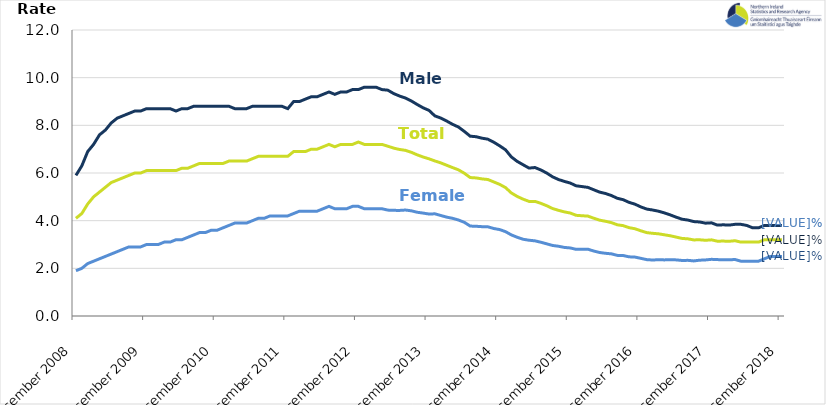
| Category | Male | Female | Total |
|---|---|---|---|
| 2008-12-01 | 5.9 | 1.9 | 4.1 |
| 2009-01-01 | 6.3 | 2 | 4.3 |
| 2009-02-01 | 6.9 | 2.2 | 4.7 |
| 2009-03-01 | 7.2 | 2.3 | 5 |
| 2009-04-01 | 7.6 | 2.4 | 5.2 |
| 2009-05-01 | 7.8 | 2.5 | 5.4 |
| 2009-06-01 | 8.1 | 2.6 | 5.6 |
| 2009-07-01 | 8.3 | 2.7 | 5.7 |
| 2009-08-01 | 8.4 | 2.8 | 5.8 |
| 2009-09-01 | 8.5 | 2.9 | 5.9 |
| 2009-10-01 | 8.6 | 2.9 | 6 |
| 2009-11-01 | 8.6 | 2.9 | 6 |
| 2009-12-01 | 8.7 | 3 | 6.1 |
| 2010-01-01 | 8.7 | 3 | 6.1 |
| 2010-02-01 | 8.7 | 3 | 6.1 |
| 2010-03-01 | 8.7 | 3.1 | 6.1 |
| 2010-04-01 | 8.7 | 3.1 | 6.1 |
| 2010-05-01 | 8.6 | 3.2 | 6.1 |
| 2010-06-01 | 8.7 | 3.2 | 6.2 |
| 2010-07-01 | 8.7 | 3.3 | 6.2 |
| 2010-08-01 | 8.8 | 3.4 | 6.3 |
| 2010-09-01 | 8.8 | 3.5 | 6.4 |
| 2010-10-01 | 8.8 | 3.5 | 6.4 |
| 2010-11-01 | 8.8 | 3.6 | 6.4 |
| 2010-12-01 | 8.8 | 3.6 | 6.4 |
| 2011-01-01 | 8.8 | 3.7 | 6.4 |
| 2011-02-01 | 8.8 | 3.8 | 6.5 |
| 2011-03-01 | 8.7 | 3.9 | 6.5 |
| 2011-04-01 | 8.7 | 3.9 | 6.5 |
| 2011-05-01 | 8.7 | 3.9 | 6.5 |
| 2011-06-01 | 8.8 | 4 | 6.6 |
| 2011-07-01 | 8.8 | 4.1 | 6.7 |
| 2011-08-01 | 8.8 | 4.1 | 6.7 |
| 2011-09-01 | 8.8 | 4.2 | 6.7 |
| 2011-10-01 | 8.8 | 4.2 | 6.7 |
| 2011-11-01 | 8.8 | 4.2 | 6.7 |
| 2011-12-01 | 8.7 | 4.2 | 6.7 |
| 2012-01-01 | 9 | 4.3 | 6.9 |
| 2012-02-01 | 9 | 4.4 | 6.9 |
| 2012-03-01 | 9.1 | 4.4 | 6.9 |
| 2012-04-01 | 9.2 | 4.4 | 7 |
| 2012-05-01 | 9.2 | 4.4 | 7 |
| 2012-06-01 | 9.3 | 4.5 | 7.1 |
| 2012-07-01 | 9.4 | 4.6 | 7.2 |
| 2012-08-01 | 9.3 | 4.5 | 7.1 |
| 2012-09-01 | 9.4 | 4.5 | 7.2 |
| 2012-10-01 | 9.4 | 4.5 | 7.2 |
| 2012-11-01 | 9.5 | 4.6 | 7.2 |
| 2012-12-01 | 9.5 | 4.6 | 7.3 |
| 2013-01-01 | 9.6 | 4.5 | 7.2 |
| 2013-02-01 | 9.6 | 4.5 | 7.2 |
| 2013-03-01 | 9.6 | 4.5 | 7.2 |
| 2013-04-01 | 9.5 | 4.5 | 7.2 |
| 2013-05-01 | 9.476 | 4.443 | 7.125 |
| 2013-06-01 | 9.332 | 4.433 | 7.043 |
| 2013-07-01 | 9.229 | 4.43 | 6.987 |
| 2013-08-01 | 9.146 | 4.446 | 6.95 |
| 2013-09-01 | 9.022 | 4.413 | 6.869 |
| 2013-10-01 | 8.874 | 4.352 | 6.761 |
| 2013-11-01 | 8.735 | 4.318 | 6.671 |
| 2013-12-01 | 8.627 | 4.278 | 6.595 |
| 2014-01-01 | 8.395 | 4.288 | 6.505 |
| 2014-02-01 | 8.306 | 4.217 | 6.424 |
| 2014-03-01 | 8.181 | 4.149 | 6.326 |
| 2014-04-01 | 8.043 | 4.098 | 6.228 |
| 2014-05-01 | 7.929 | 4.028 | 6.134 |
| 2014-06-01 | 7.745 | 3.931 | 5.99 |
| 2014-07-01 | 7.545 | 3.774 | 5.81 |
| 2014-08-01 | 7.522 | 3.765 | 5.793 |
| 2014-09-01 | 7.461 | 3.748 | 5.752 |
| 2014-10-01 | 7.419 | 3.743 | 5.727 |
| 2014-11-01 | 7.293 | 3.672 | 5.627 |
| 2014-12-01 | 7.141 | 3.626 | 5.523 |
| 2015-01-01 | 6.975 | 3.54 | 5.389 |
| 2015-02-01 | 6.672 | 3.401 | 5.162 |
| 2015-03-01 | 6.485 | 3.302 | 5.016 |
| 2015-04-01 | 6.344 | 3.219 | 4.901 |
| 2015-05-01 | 6.207 | 3.179 | 4.809 |
| 2015-06-01 | 6.229 | 3.154 | 4.809 |
| 2015-07-01 | 6.128 | 3.095 | 4.728 |
| 2015-08-01 | 5.999 | 3.028 | 4.627 |
| 2015-09-01 | 5.839 | 2.959 | 4.509 |
| 2015-10-01 | 5.727 | 2.927 | 4.434 |
| 2015-11-01 | 5.648 | 2.877 | 4.368 |
| 2015-12-01 | 5.578 | 2.856 | 4.321 |
| 2016-01-01 | 5.463 | 2.797 | 4.225 |
| 2016-02-01 | 5.431 | 2.796 | 4.207 |
| 2016-03-01 | 5.396 | 2.802 | 4.191 |
| 2016-04-01 | 5.297 | 2.726 | 4.103 |
| 2016-05-01 | 5.198 | 2.665 | 4.021 |
| 2016-06-01 | 5.14 | 2.631 | 3.974 |
| 2016-07-01 | 5.054 | 2.608 | 3.918 |
| 2016-08-01 | 4.939 | 2.544 | 3.827 |
| 2016-09-01 | 4.88 | 2.537 | 3.791 |
| 2016-10-01 | 4.768 | 2.483 | 3.707 |
| 2016-11-01 | 4.692 | 2.471 | 3.661 |
| 2016-12-01 | 4.577 | 2.42 | 3.575 |
| 2017-01-01 | 4.487 | 2.365 | 3.498 |
| 2017-02-01 | 4.447 | 2.349 | 3.469 |
| 2017-03-01 | 4.397 | 2.362 | 3.448 |
| 2017-04-01 | 4.326 | 2.354 | 3.407 |
| 2017-05-01 | 4.241 | 2.364 | 3.366 |
| 2017-06-01 | 4.147 | 2.354 | 3.311 |
| 2017-07-01 | 4.062 | 2.33 | 3.255 |
| 2017-08-01 | 4.025 | 2.335 | 3.237 |
| 2017-09-01 | 3.962 | 2.311 | 3.192 |
| 2017-10-01 | 3.945 | 2.341 | 3.198 |
| 2017-11-01 | 3.895 | 2.353 | 3.176 |
| 2017-12-01 | 3.909 | 2.378 | 3.196 |
| 2018-01-01 | 3.814 | 2.366 | 3.139 |
| 2018-02-01 | 3.826 | 2.361 | 3.143 |
| 2018-03-01 | 3.814 | 2.357 | 3.135 |
| 2018-04-01 | 3.846 | 2.371 | 3.159 |
| 2018-05-01 | 3.846 | 2.3 | 3.1 |
| 2018-06-01 | 3.8 | 2.3 | 3.1 |
| 2018-07-01 | 3.7 | 2.3 | 3.1 |
| 2018-08-01 | 3.7 | 2.3 | 3.1 |
| 2018-09-01 | 3.8 | 2.4 | 3.2 |
| 2018-10-01 | 3.8 | 2.5 | 3.2 |
| 2018-11-01 | 3.8 | 2.5 | 3.2 |
| 2018-12-01 | 3.8 | 2.5 | 3.2 |